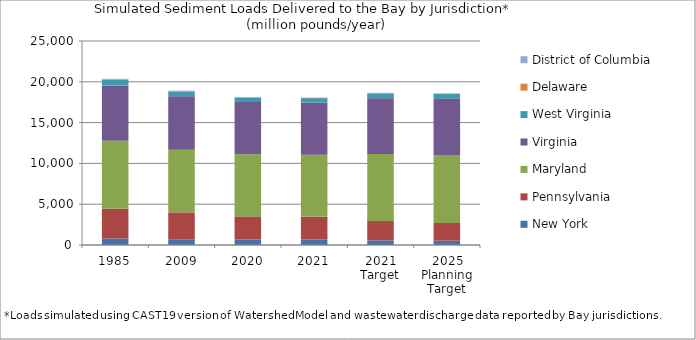
| Category | New York  | Pennsylvania  | Maryland  | Virginia  | West Virginia  | Delaware  | District of Columbia  |
|---|---|---|---|---|---|---|---|
| 1985 | 798.307 | 3638.861 | 8327.376 | 6761.794 | 733.455 | 62.914 | 43.229 |
| 2009 | 699.104 | 3299.531 | 7663.049 | 6556.935 | 597.866 | 50.316 | 43.956 |
| 2020 | 676.98 | 2828.566 | 7602.048 | 6407.422 | 559.146 | 32.175 | 35.807 |
| 2021 | 663.858 | 2784.859 | 7602.725 | 6391.717 | 553.865 | 35.403 | 35.552 |
| 2021 Target | 566.017 | 2389.09 | 8206.9 | 6809.303 | 606.686 | 31.432 | 42.343 |
| 2025 Planning Target | 532.745 | 2161.48 | 8342.863 | 6872.395 | 608.891 | 26.711 | 41.94 |